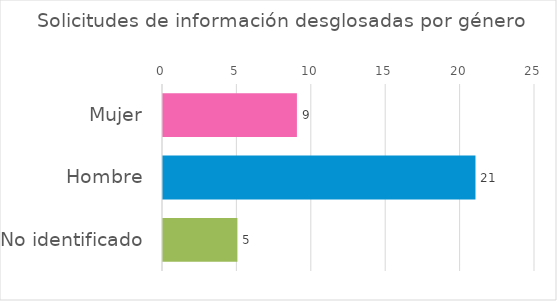
| Category | Series 0 |
|---|---|
| Mujer | 9 |
| Hombre | 21 |
| No identificado | 5 |